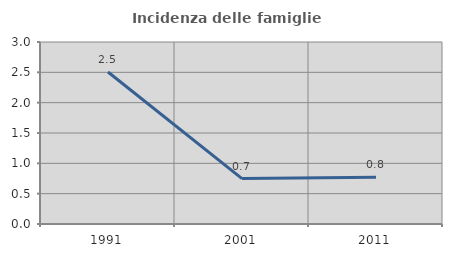
| Category | Incidenza delle famiglie numerose |
|---|---|
| 1991.0 | 2.506 |
| 2001.0 | 0.749 |
| 2011.0 | 0.771 |